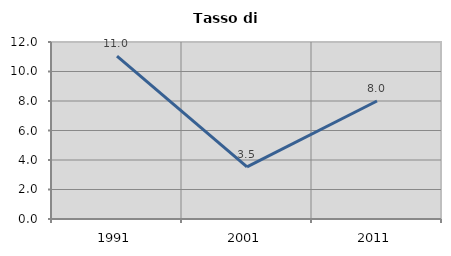
| Category | Tasso di disoccupazione   |
|---|---|
| 1991.0 | 11.047 |
| 2001.0 | 3.529 |
| 2011.0 | 8 |